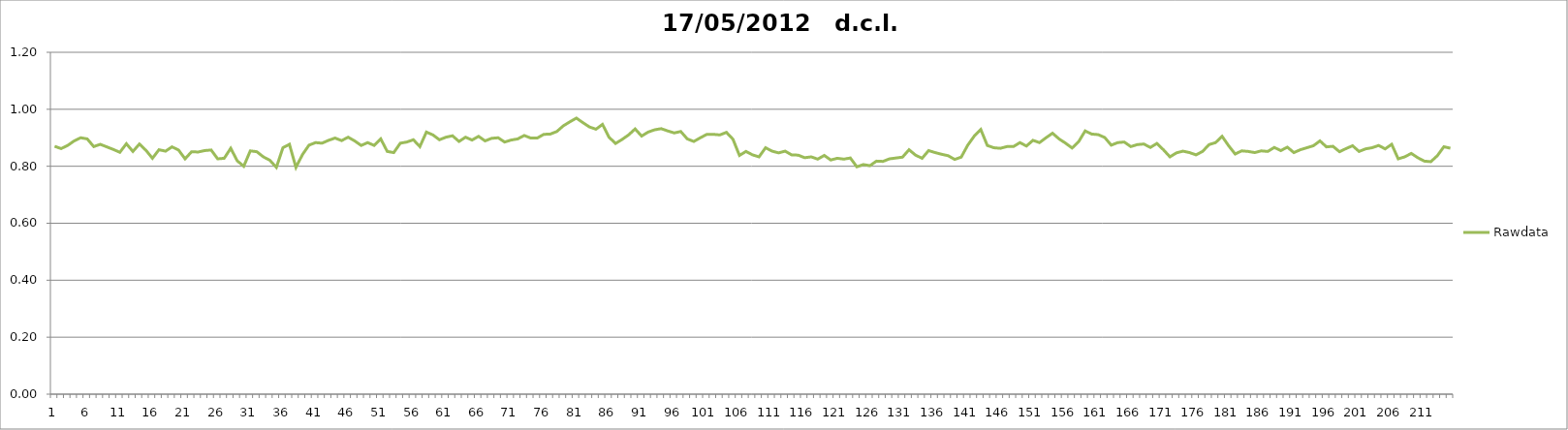
| Category | Rawdata |
|---|---|
| 0 | 0.87 |
| 1 | 0.862 |
| 2 | 0.873 |
| 3 | 0.889 |
| 4 | 0.9 |
| 5 | 0.896 |
| 6 | 0.869 |
| 7 | 0.877 |
| 8 | 0.868 |
| 9 | 0.859 |
| 10 | 0.849 |
| 11 | 0.879 |
| 12 | 0.852 |
| 13 | 0.878 |
| 14 | 0.856 |
| 15 | 0.828 |
| 16 | 0.858 |
| 17 | 0.853 |
| 18 | 0.868 |
| 19 | 0.857 |
| 20 | 0.826 |
| 21 | 0.851 |
| 22 | 0.85 |
| 23 | 0.855 |
| 24 | 0.857 |
| 25 | 0.826 |
| 26 | 0.828 |
| 27 | 0.863 |
| 28 | 0.819 |
| 29 | 0.8 |
| 30 | 0.854 |
| 31 | 0.851 |
| 32 | 0.833 |
| 33 | 0.821 |
| 34 | 0.796 |
| 35 | 0.865 |
| 36 | 0.877 |
| 37 | 0.796 |
| 38 | 0.841 |
| 39 | 0.874 |
| 40 | 0.883 |
| 41 | 0.881 |
| 42 | 0.891 |
| 43 | 0.899 |
| 44 | 0.89 |
| 45 | 0.902 |
| 46 | 0.889 |
| 47 | 0.873 |
| 48 | 0.883 |
| 49 | 0.873 |
| 50 | 0.896 |
| 51 | 0.852 |
| 52 | 0.848 |
| 53 | 0.881 |
| 54 | 0.885 |
| 55 | 0.893 |
| 56 | 0.869 |
| 57 | 0.92 |
| 58 | 0.91 |
| 59 | 0.893 |
| 60 | 0.902 |
| 61 | 0.907 |
| 62 | 0.887 |
| 63 | 0.902 |
| 64 | 0.892 |
| 65 | 0.905 |
| 66 | 0.889 |
| 67 | 0.898 |
| 68 | 0.9 |
| 69 | 0.885 |
| 70 | 0.892 |
| 71 | 0.896 |
| 72 | 0.908 |
| 73 | 0.899 |
| 74 | 0.899 |
| 75 | 0.912 |
| 76 | 0.913 |
| 77 | 0.922 |
| 78 | 0.942 |
| 79 | 0.956 |
| 80 | 0.969 |
| 81 | 0.953 |
| 82 | 0.938 |
| 83 | 0.93 |
| 84 | 0.947 |
| 85 | 0.902 |
| 86 | 0.88 |
| 87 | 0.894 |
| 88 | 0.91 |
| 89 | 0.931 |
| 90 | 0.906 |
| 91 | 0.92 |
| 92 | 0.928 |
| 93 | 0.932 |
| 94 | 0.924 |
| 95 | 0.917 |
| 96 | 0.922 |
| 97 | 0.896 |
| 98 | 0.887 |
| 99 | 0.9 |
| 100 | 0.912 |
| 101 | 0.912 |
| 102 | 0.91 |
| 103 | 0.919 |
| 104 | 0.895 |
| 105 | 0.838 |
| 106 | 0.852 |
| 107 | 0.84 |
| 108 | 0.833 |
| 109 | 0.865 |
| 110 | 0.853 |
| 111 | 0.847 |
| 112 | 0.853 |
| 113 | 0.84 |
| 114 | 0.839 |
| 115 | 0.83 |
| 116 | 0.833 |
| 117 | 0.825 |
| 118 | 0.838 |
| 119 | 0.822 |
| 120 | 0.828 |
| 121 | 0.825 |
| 122 | 0.829 |
| 123 | 0.798 |
| 124 | 0.806 |
| 125 | 0.802 |
| 126 | 0.818 |
| 127 | 0.817 |
| 128 | 0.826 |
| 129 | 0.829 |
| 130 | 0.832 |
| 131 | 0.858 |
| 132 | 0.839 |
| 133 | 0.828 |
| 134 | 0.855 |
| 135 | 0.848 |
| 136 | 0.842 |
| 137 | 0.837 |
| 138 | 0.824 |
| 139 | 0.832 |
| 140 | 0.874 |
| 141 | 0.906 |
| 142 | 0.929 |
| 143 | 0.873 |
| 144 | 0.865 |
| 145 | 0.863 |
| 146 | 0.869 |
| 147 | 0.869 |
| 148 | 0.883 |
| 149 | 0.871 |
| 150 | 0.891 |
| 151 | 0.883 |
| 152 | 0.9 |
| 153 | 0.916 |
| 154 | 0.896 |
| 155 | 0.881 |
| 156 | 0.864 |
| 157 | 0.886 |
| 158 | 0.924 |
| 159 | 0.913 |
| 160 | 0.911 |
| 161 | 0.901 |
| 162 | 0.874 |
| 163 | 0.883 |
| 164 | 0.885 |
| 165 | 0.869 |
| 166 | 0.876 |
| 167 | 0.878 |
| 168 | 0.866 |
| 169 | 0.88 |
| 170 | 0.858 |
| 171 | 0.833 |
| 172 | 0.847 |
| 173 | 0.853 |
| 174 | 0.848 |
| 175 | 0.84 |
| 176 | 0.852 |
| 177 | 0.876 |
| 178 | 0.883 |
| 179 | 0.905 |
| 180 | 0.872 |
| 181 | 0.843 |
| 182 | 0.854 |
| 183 | 0.852 |
| 184 | 0.848 |
| 185 | 0.854 |
| 186 | 0.852 |
| 187 | 0.866 |
| 188 | 0.855 |
| 189 | 0.867 |
| 190 | 0.848 |
| 191 | 0.858 |
| 192 | 0.865 |
| 193 | 0.872 |
| 194 | 0.889 |
| 195 | 0.868 |
| 196 | 0.87 |
| 197 | 0.851 |
| 198 | 0.862 |
| 199 | 0.872 |
| 200 | 0.852 |
| 201 | 0.861 |
| 202 | 0.865 |
| 203 | 0.873 |
| 204 | 0.861 |
| 205 | 0.877 |
| 206 | 0.826 |
| 207 | 0.833 |
| 208 | 0.845 |
| 209 | 0.83 |
| 210 | 0.818 |
| 211 | 0.816 |
| 212 | 0.837 |
| 213 | 0.868 |
| 214 | 0.863 |